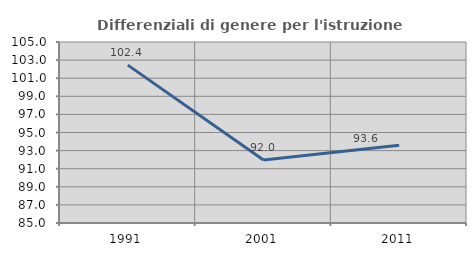
| Category | Differenziali di genere per l'istruzione superiore |
|---|---|
| 1991.0 | 102.445 |
| 2001.0 | 91.97 |
| 2011.0 | 93.591 |